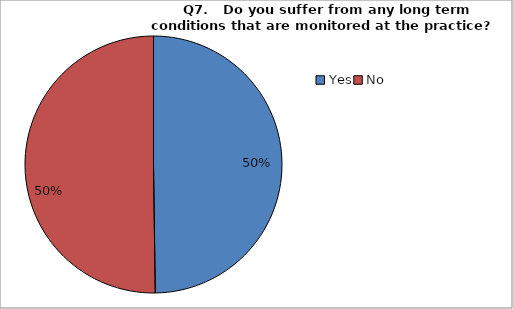
| Category | Series 0 |
|---|---|
| Yes | 226 |
| No | 228 |